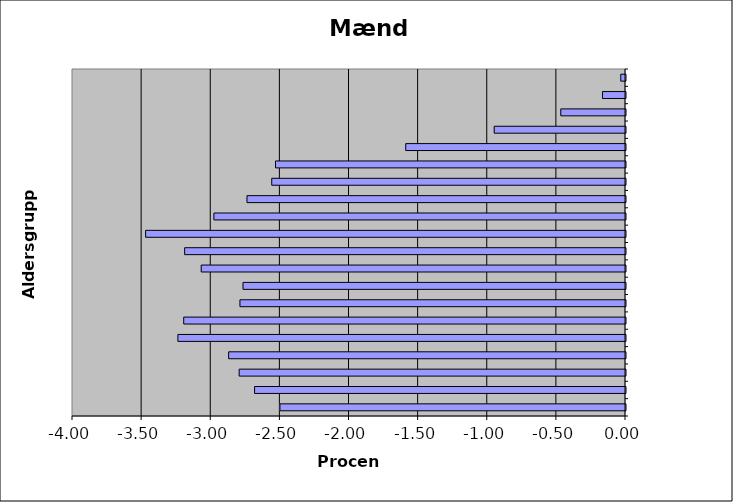
| Category | Mænd |
|---|---|
|  | -2.5 |
|  | -2.683 |
|  | -2.794 |
|  | -2.871 |
|  | -3.238 |
|  | -3.196 |
|  | -2.789 |
|  | -2.767 |
|  | -3.069 |
|  | -3.189 |
|  | -3.471 |
|  | -2.977 |
|  | -2.738 |
|  | -2.559 |
|  | -2.531 |
|  | -1.59 |
|  | -0.95 |
|  | -0.468 |
|  | -0.166 |
|  | -0.034 |